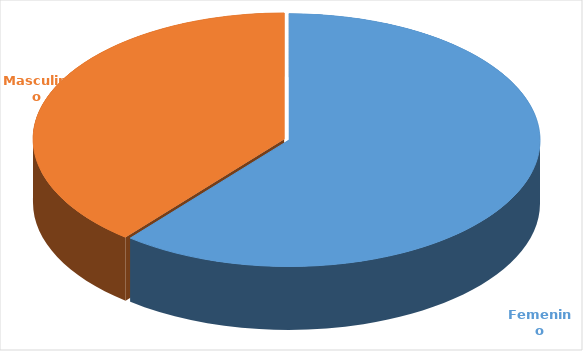
| Category | Cantidad  |
|---|---|
| Femenino | 3535 |
| Masculino | 2272 |